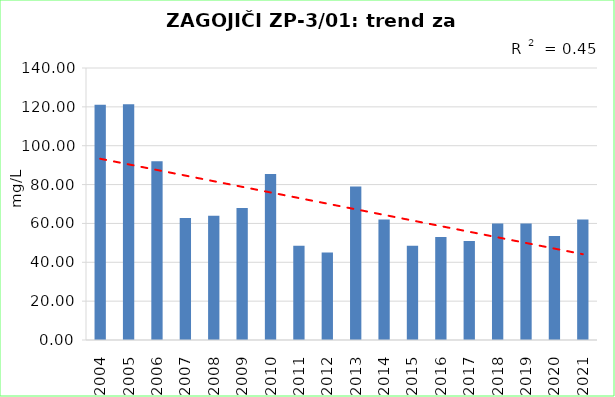
| Category | Vsota |
|---|---|
| 2004 | 121.067 |
| 2005 | 121.333 |
| 2006 | 92 |
| 2007 | 62.75 |
| 2008 | 64 |
| 2009 | 68 |
| 2010 | 85.5 |
| 2011 | 48.5 |
| 2012 | 45 |
| 2013 | 79 |
| 2014 | 62 |
| 2015 | 48.5 |
| 2016 | 53 |
| 2017 | 51 |
| 2018 | 60 |
| 2019 | 60 |
| 2020 | 53.5 |
| 2021 | 62 |